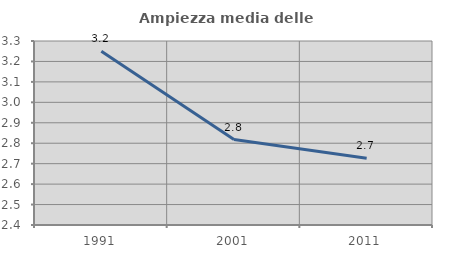
| Category | Ampiezza media delle famiglie |
|---|---|
| 1991.0 | 3.249 |
| 2001.0 | 2.818 |
| 2011.0 | 2.726 |